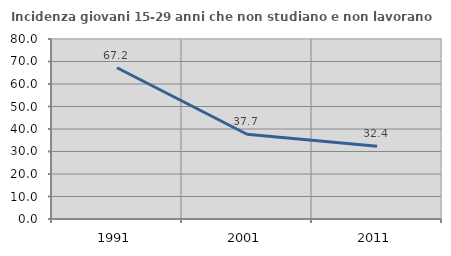
| Category | Incidenza giovani 15-29 anni che non studiano e non lavorano  |
|---|---|
| 1991.0 | 67.239 |
| 2001.0 | 37.681 |
| 2011.0 | 32.376 |